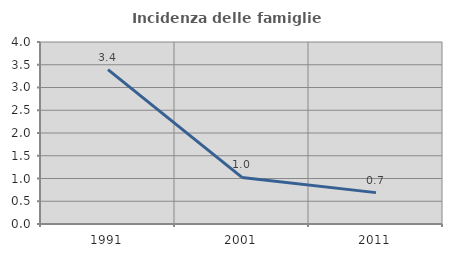
| Category | Incidenza delle famiglie numerose |
|---|---|
| 1991.0 | 3.393 |
| 2001.0 | 1.024 |
| 2011.0 | 0.69 |